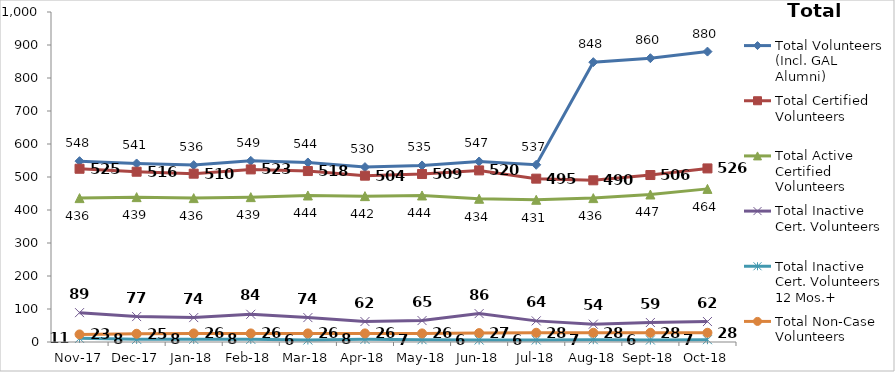
| Category | Total Volunteers (Incl. GAL Alumni) | Total Certified Volunteers | Total Active Certified Volunteers | Total Inactive Cert. Volunteers | Total Inactive Cert. Volunteers 12 Mos.+ | Total Non-Case Volunteers |
|---|---|---|---|---|---|---|
| 2017-11-01 | 548 | 525 | 436 | 89 | 11 | 23 |
| 2017-12-01 | 541 | 516 | 439 | 77 | 8 | 25 |
| 2018-01-01 | 536 | 510 | 436 | 74 | 8 | 26 |
| 2018-02-01 | 549 | 523 | 439 | 84 | 8 | 26 |
| 2018-03-01 | 544 | 518 | 444 | 74 | 6 | 26 |
| 2018-04-01 | 530 | 504 | 442 | 62 | 8 | 26 |
| 2018-05-01 | 535 | 509 | 444 | 65 | 7 | 26 |
| 2018-06-01 | 547 | 520 | 434 | 86 | 6 | 27 |
| 2018-07-01 | 537 | 495 | 431 | 64 | 6 | 28 |
| 2018-08-01 | 848 | 490 | 436 | 54 | 7 | 28 |
| 2018-09-01 | 860 | 506 | 447 | 59 | 6 | 28 |
| 2018-10-01 | 880 | 526 | 464 | 62 | 7 | 28 |